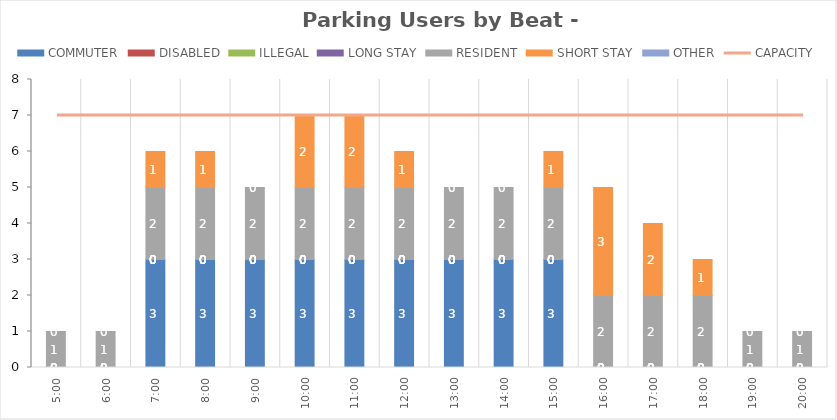
| Category | COMMUTER | DISABLED | ILLEGAL | LONG STAY | RESIDENT | SHORT STAY | OTHER |
|---|---|---|---|---|---|---|---|
| 0.20833333333333334 | 0 | 0 | 0 | 0 | 1 | 0 | 0 |
| 0.25 | 0 | 0 | 0 | 0 | 1 | 0 | 0 |
| 0.2916666666666667 | 3 | 0 | 0 | 0 | 2 | 1 | 0 |
| 0.3333333333333333 | 3 | 0 | 0 | 0 | 2 | 1 | 0 |
| 0.375 | 3 | 0 | 0 | 0 | 2 | 0 | 0 |
| 0.4166666666666667 | 3 | 0 | 0 | 0 | 2 | 2 | 0 |
| 0.4583333333333333 | 3 | 0 | 0 | 0 | 2 | 2 | 0 |
| 0.5 | 3 | 0 | 0 | 0 | 2 | 1 | 0 |
| 0.5416666666666666 | 3 | 0 | 0 | 0 | 2 | 0 | 0 |
| 0.5833333333333334 | 3 | 0 | 0 | 0 | 2 | 0 | 0 |
| 0.625 | 3 | 0 | 0 | 0 | 2 | 1 | 0 |
| 0.6666666666666666 | 0 | 0 | 0 | 0 | 2 | 3 | 0 |
| 0.7083333333333334 | 0 | 0 | 0 | 0 | 2 | 2 | 0 |
| 0.75 | 0 | 0 | 0 | 0 | 2 | 1 | 0 |
| 0.7916666666666666 | 0 | 0 | 0 | 0 | 1 | 0 | 0 |
| 0.8333333333333334 | 0 | 0 | 0 | 0 | 1 | 0 | 0 |